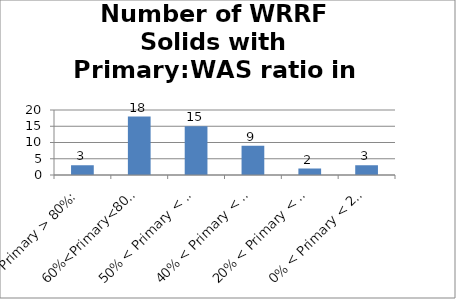
| Category | Series 0 |
|---|---|
| Primary > 80%: | 3 |
| 60%<Primary<80%: | 18 |
| 50% < Primary < 60%: | 15 |
| 40% < Primary < 50%: | 9 |
| 20% < Primary < 40%: | 2 |
| 0% < Primary < 20%: | 3 |